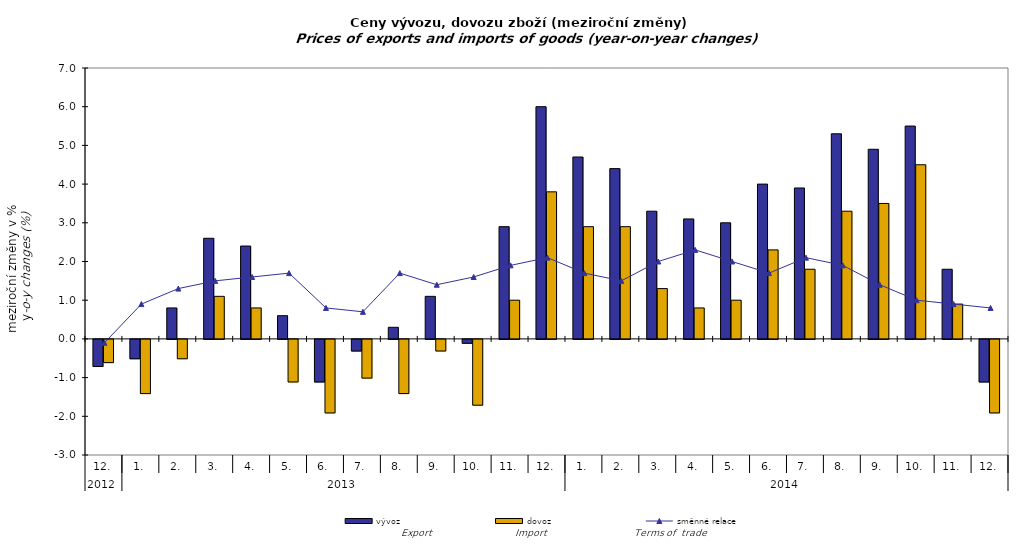
| Category | vývoz | dovoz |
|---|---|---|
| 0 | -0.7 | -0.6 |
| 1 | -0.5 | -1.4 |
| 2 | 0.8 | -0.5 |
| 3 | 2.6 | 1.1 |
| 4 | 2.4 | 0.8 |
| 5 | 0.6 | -1.1 |
| 6 | -1.1 | -1.9 |
| 7 | -0.3 | -1 |
| 8 | 0.3 | -1.4 |
| 9 | 1.1 | -0.3 |
| 10 | -0.1 | -1.7 |
| 11 | 2.9 | 1 |
| 12 | 6 | 3.8 |
| 13 | 4.7 | 2.9 |
| 14 | 4.4 | 2.9 |
| 15 | 3.3 | 1.3 |
| 16 | 3.1 | 0.8 |
| 17 | 3 | 1 |
| 18 | 4 | 2.3 |
| 19 | 3.9 | 1.8 |
| 20 | 5.3 | 3.3 |
| 21 | 4.9 | 3.5 |
| 22 | 5.5 | 4.5 |
| 23 | 1.8 | 0.9 |
| 24 | -1.1 | -1.9 |